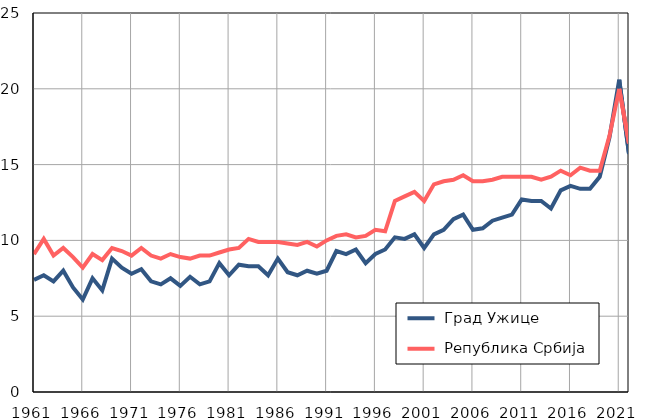
| Category |  Град Ужице |  Република Србија |
|---|---|---|
| 1961.0 | 7.4 | 9.1 |
| 1962.0 | 7.7 | 10.1 |
| 1963.0 | 7.3 | 9 |
| 1964.0 | 8 | 9.5 |
| 1965.0 | 6.9 | 8.9 |
| 1966.0 | 6.1 | 8.2 |
| 1967.0 | 7.5 | 9.1 |
| 1968.0 | 6.7 | 8.7 |
| 1969.0 | 8.8 | 9.5 |
| 1970.0 | 8.2 | 9.3 |
| 1971.0 | 7.8 | 9 |
| 1972.0 | 8.1 | 9.5 |
| 1973.0 | 7.3 | 9 |
| 1974.0 | 7.1 | 8.8 |
| 1975.0 | 7.5 | 9.1 |
| 1976.0 | 7 | 8.9 |
| 1977.0 | 7.6 | 8.8 |
| 1978.0 | 7.1 | 9 |
| 1979.0 | 7.3 | 9 |
| 1980.0 | 8.5 | 9.2 |
| 1981.0 | 7.7 | 9.4 |
| 1982.0 | 8.4 | 9.5 |
| 1983.0 | 8.3 | 10.1 |
| 1984.0 | 8.3 | 9.9 |
| 1985.0 | 7.7 | 9.9 |
| 1986.0 | 8.8 | 9.9 |
| 1987.0 | 7.9 | 9.8 |
| 1988.0 | 7.7 | 9.7 |
| 1989.0 | 8 | 9.9 |
| 1990.0 | 7.8 | 9.6 |
| 1991.0 | 8 | 10 |
| 1992.0 | 9.3 | 10.3 |
| 1993.0 | 9.1 | 10.4 |
| 1994.0 | 9.4 | 10.2 |
| 1995.0 | 8.5 | 10.3 |
| 1996.0 | 9.1 | 10.7 |
| 1997.0 | 9.4 | 10.6 |
| 1998.0 | 10.2 | 12.6 |
| 1999.0 | 10.1 | 12.9 |
| 2000.0 | 10.4 | 13.2 |
| 2001.0 | 9.5 | 12.6 |
| 2002.0 | 10.4 | 13.7 |
| 2003.0 | 10.7 | 13.9 |
| 2004.0 | 11.4 | 14 |
| 2005.0 | 11.7 | 14.3 |
| 2006.0 | 10.7 | 13.9 |
| 2007.0 | 10.8 | 13.9 |
| 2008.0 | 11.3 | 14 |
| 2009.0 | 11.5 | 14.2 |
| 2010.0 | 11.7 | 14.2 |
| 2011.0 | 12.7 | 14.2 |
| 2012.0 | 12.6 | 14.2 |
| 2013.0 | 12.6 | 14 |
| 2014.0 | 12.1 | 14.2 |
| 2015.0 | 13.3 | 14.6 |
| 2016.0 | 13.6 | 14.3 |
| 2017.0 | 13.4 | 14.8 |
| 2018.0 | 13.4 | 14.6 |
| 2019.0 | 14.2 | 14.6 |
| 2020.0 | 16.8 | 16.9 |
| 2021.0 | 20.6 | 20 |
| 2022.0 | 15.7 | 16.4 |